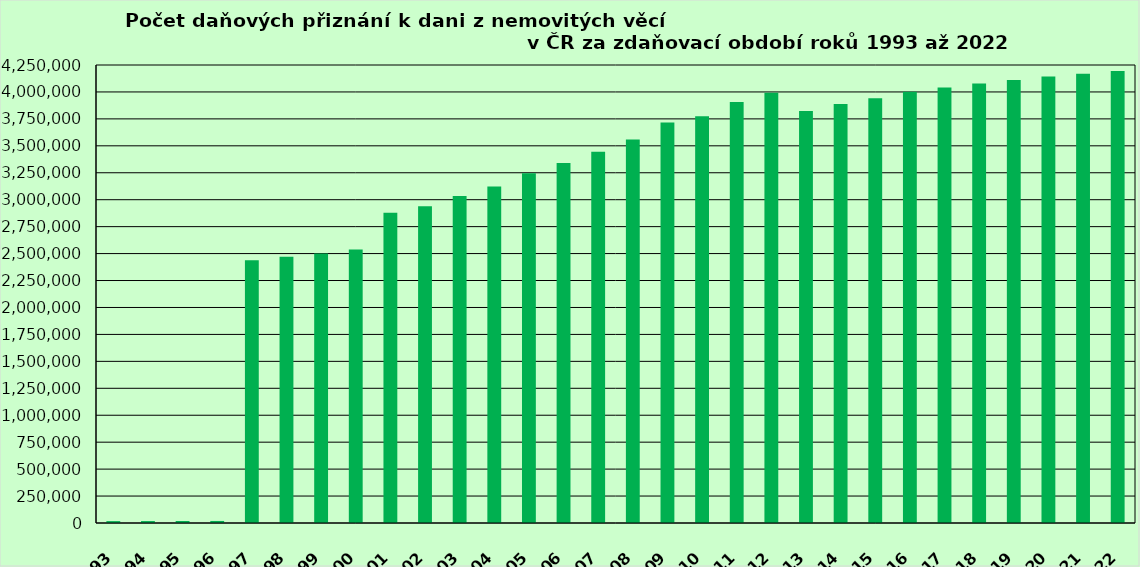
| Category | Series 0 |
|---|---|
| 1993.0 | 17588 |
| 1994.0 | 17987 |
| 1995.0 | 18600 |
| 1996.0 | 18996 |
| 1997.0 | 2439143 |
| 1998.0 | 2470419 |
| 1999.0 | 2500868 |
| 2000.0 | 2536826 |
| 2001.0 | 2879285 |
| 2002.0 | 2938433 |
| 2003.0 | 3034585 |
| 2004.0 | 3121985 |
| 2005.0 | 3246310 |
| 2006.0 | 3340780 |
| 2007.0 | 3446095 |
| 2008.0 | 3558492 |
| 2009.0 | 3715437 |
| 2010.0 | 3775003 |
| 2011.0 | 3906128 |
| 2012.0 | 3992700 |
| 2013.0 | 3822792 |
| 2014.0 | 3888529 |
| 2015.0 | 3942531 |
| 2016.0 | 4002116 |
| 2017.0 | 4042325 |
| 2018.0 | 4077295 |
| 2019.0 | 4111922 |
| 2020.0 | 4142171 |
| 2021.0 | 4168356 |
| 2022.0 | 4194558 |